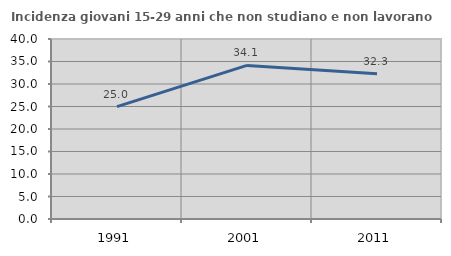
| Category | Incidenza giovani 15-29 anni che non studiano e non lavorano  |
|---|---|
| 1991.0 | 24.97 |
| 2001.0 | 34.126 |
| 2011.0 | 32.28 |